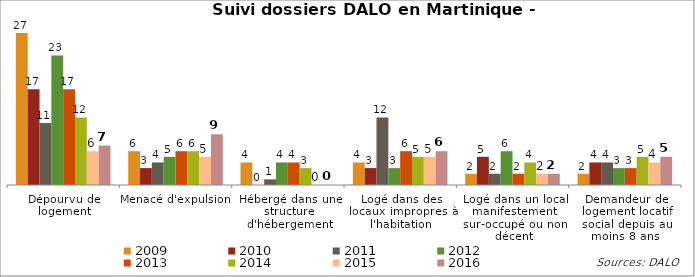
| Category | 2009 | 2010 | 2011 | 2012 | 2013 | 2014 | 2015 | 2016 |
|---|---|---|---|---|---|---|---|---|
| Dépourvu de logement | 27 | 17 | 11 | 23 | 17 | 12 | 6 | 7 |
| Menacé d'expulsion | 6 | 3 | 4 | 5 | 6 | 6 | 5 | 9 |
| Hébergé dans une structure d'hébergement | 4 | 0 | 1 | 4 | 4 | 3 | 0 | 0 |
| Logé dans des locaux impropres à l'habitation | 4 | 3 | 12 | 3 | 6 | 5 | 5 | 6 |
| Logé dans un local manifestement sur-occupé ou non décent | 2 | 5 | 2 | 6 | 2 | 4 | 2 | 2 |
| Demandeur de logement locatif social depuis au moins 8 ans  | 2 | 4 | 4 | 3 | 3 | 5 | 4 | 5 |